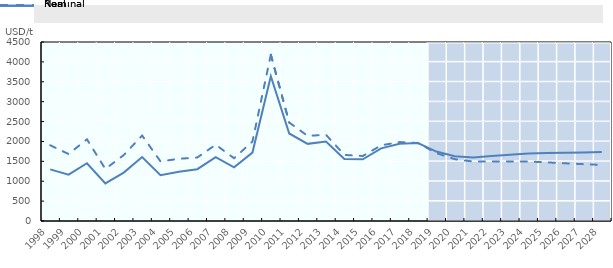
| Category | Projected1 | Projected2 | Projected3 | Projected4 | Projected5 | Projected6 | Projected7 | Projected8 | Projected9 |
|---|---|---|---|---|---|---|---|---|---|
| 1998.0 | 0 | 0 | 0 | 0 | 0 | 0 | 0 | 0 | 0 |
| 1999.0 | 0 | 0 | 0 | 0 | 0 | 0 | 0 | 0 | 0 |
| 2000.0 | 0 | 0 | 0 | 0 | 0 | 0 | 0 | 0 | 0 |
| 2001.0 | 0 | 0 | 0 | 0 | 0 | 0 | 0 | 0 | 0 |
| 2002.0 | 0 | 0 | 0 | 0 | 0 | 0 | 0 | 0 | 0 |
| 2003.0 | 0 | 0 | 0 | 0 | 0 | 0 | 0 | 0 | 0 |
| 2004.0 | 0 | 0 | 0 | 0 | 0 | 0 | 0 | 0 | 0 |
| 2005.0 | 0 | 0 | 0 | 0 | 0 | 0 | 0 | 0 | 0 |
| 2006.0 | 0 | 0 | 0 | 0 | 0 | 0 | 0 | 0 | 0 |
| 2007.0 | 0 | 0 | 0 | 0 | 0 | 0 | 0 | 0 | 0 |
| 2008.0 | 0 | 0 | 0 | 0 | 0 | 0 | 0 | 0 | 0 |
| 2009.0 | 0 | 0 | 0 | 0 | 0 | 0 | 0 | 0 | 0 |
| 2010.0 | 0 | 0 | 0 | 0 | 0 | 0 | 0 | 0 | 0 |
| 2011.0 | 0 | 0 | 0 | 0 | 0 | 0 | 0 | 0 | 0 |
| 2012.0 | 0 | 0 | 0 | 0 | 0 | 0 | 0 | 0 | 0 |
| 2013.0 | 0 | 0 | 0 | 0 | 0 | 0 | 0 | 0 | 0 |
| 2014.0 | 0 | 0 | 0 | 0 | 0 | 0 | 0 | 0 | 0 |
| 2015.0 | 0 | 0 | 0 | 0 | 0 | 0 | 0 | 0 | 0 |
| 2016.0 | 0 | 0 | 0 | 0 | 0 | 0 | 0 | 0 | 0 |
| 2017.0 | 0 | 0 | 0 | 0 | 0 | 0 | 0 | 0 | 0 |
| 2018.0 | 0 | 0 | 0 | 0 | 0 | 0 | 0 | 0 | 0 |
| 2019.0 | 1 | 1 | 1 | 1 | 1 | 1 | 1 | 1 | 0.95 |
| 2020.0 | 1 | 1 | 1 | 1 | 1 | 1 | 1 | 1 | 0.95 |
| 2021.0 | 1 | 1 | 1 | 1 | 1 | 1 | 1 | 1 | 0.95 |
| 2022.0 | 1 | 1 | 1 | 1 | 1 | 1 | 1 | 1 | 0.95 |
| 2023.0 | 1 | 1 | 1 | 1 | 1 | 1 | 1 | 1 | 0.95 |
| 2024.0 | 1 | 1 | 1 | 1 | 1 | 1 | 1 | 1 | 0.95 |
| 2025.0 | 1 | 1 | 1 | 1 | 1 | 1 | 1 | 1 | 0.95 |
| 2026.0 | 1 | 1 | 1 | 1 | 1 | 1 | 1 | 1 | 0.95 |
| 2027.0 | 1 | 1 | 1 | 1 | 1 | 1 | 1 | 1 | 0.95 |
| 2028.0 | 1 | 1 | 1 | 1 | 1 | 1 | 1 | 1 | 0.95 |